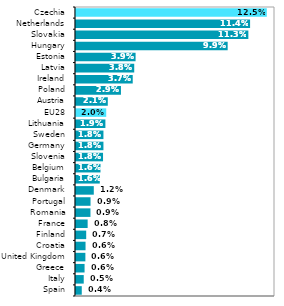
| Category | Series 0 |
|---|---|
| Spain | 0.004 |
| Italy | 0.005 |
| Greece | 0.006 |
| United Kingdom | 0.006 |
| Croatia | 0.006 |
| Finland | 0.007 |
| France | 0.008 |
| Romania | 0.009 |
| Portugal | 0.009 |
| Denmark | 0.012 |
| Bulgaria | 0.016 |
| Belgium | 0.016 |
| Slovenia | 0.018 |
| Germany | 0.018 |
| Sweden | 0.018 |
| Lithuania | 0.019 |
| EU28 | 0.02 |
| Austria | 0.021 |
| Poland | 0.029 |
| Ireland | 0.037 |
| Latvia | 0.038 |
| Estonia | 0.039 |
| Hungary | 0.099 |
| Slovakia | 0.113 |
| Netherlands | 0.114 |
| Czechia | 0.125 |